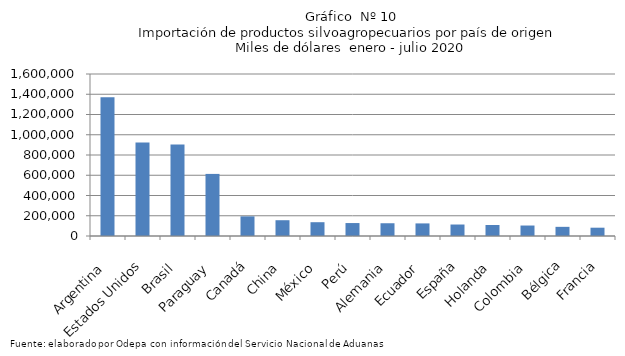
| Category | Series 0 |
|---|---|
| Argentina | 1371496.253 |
| Estados Unidos | 923096.883 |
| Brasil | 904039.049 |
| Paraguay | 613252.991 |
| Canadá | 193857.365 |
| China | 155853.409 |
| México | 136238.08 |
| Perú | 127861.447 |
| Alemania | 125953.127 |
| Ecuador | 124370.836 |
| España | 113415.729 |
| Holanda | 108884.163 |
| Colombia | 103428.462 |
| Bélgica | 90449.846 |
| Francia | 81999.639 |